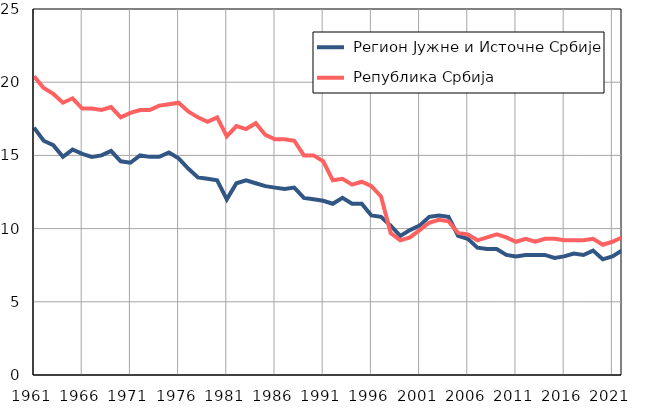
| Category |  Регион Јужне и Источне Србије |  Република Србија |
|---|---|---|
| 1961.0 | 16.9 | 20.4 |
| 1962.0 | 16 | 19.6 |
| 1963.0 | 15.7 | 19.2 |
| 1964.0 | 14.9 | 18.6 |
| 1965.0 | 15.4 | 18.9 |
| 1966.0 | 15.1 | 18.2 |
| 1967.0 | 14.9 | 18.2 |
| 1968.0 | 15 | 18.1 |
| 1969.0 | 15.3 | 18.3 |
| 1970.0 | 14.6 | 17.6 |
| 1971.0 | 14.5 | 17.9 |
| 1972.0 | 15 | 18.1 |
| 1973.0 | 14.9 | 18.1 |
| 1974.0 | 14.9 | 18.4 |
| 1975.0 | 15.2 | 18.5 |
| 1976.0 | 14.8 | 18.6 |
| 1977.0 | 14.1 | 18 |
| 1978.0 | 13.5 | 17.6 |
| 1979.0 | 13.4 | 17.3 |
| 1980.0 | 13.3 | 17.6 |
| 1981.0 | 12 | 16.3 |
| 1982.0 | 13.1 | 17 |
| 1983.0 | 13.3 | 16.8 |
| 1984.0 | 13.1 | 17.2 |
| 1985.0 | 12.9 | 16.4 |
| 1986.0 | 12.8 | 16.1 |
| 1987.0 | 12.7 | 16.1 |
| 1988.0 | 12.8 | 16 |
| 1989.0 | 12.1 | 15 |
| 1990.0 | 12 | 15 |
| 1991.0 | 11.9 | 14.6 |
| 1992.0 | 11.7 | 13.3 |
| 1993.0 | 12.1 | 13.4 |
| 1994.0 | 11.7 | 13 |
| 1995.0 | 11.7 | 13.2 |
| 1996.0 | 10.9 | 12.9 |
| 1997.0 | 10.8 | 12.2 |
| 1998.0 | 10.2 | 9.7 |
| 1999.0 | 9.5 | 9.2 |
| 2000.0 | 9.9 | 9.4 |
| 2001.0 | 10.2 | 9.9 |
| 2002.0 | 10.8 | 10.4 |
| 2003.0 | 10.9 | 10.6 |
| 2004.0 | 10.8 | 10.5 |
| 2005.0 | 9.5 | 9.7 |
| 2006.0 | 9.3 | 9.6 |
| 2007.0 | 8.7 | 9.2 |
| 2008.0 | 8.6 | 9.4 |
| 2009.0 | 8.6 | 9.6 |
| 2010.0 | 8.2 | 9.4 |
| 2011.0 | 8.1 | 9.1 |
| 2012.0 | 8.2 | 9.3 |
| 2013.0 | 8.2 | 9.1 |
| 2014.0 | 8.2 | 9.3 |
| 2015.0 | 8 | 9.3 |
| 2016.0 | 8.1 | 9.2 |
| 2017.0 | 8.3 | 9.2 |
| 2018.0 | 8.2 | 9.2 |
| 2019.0 | 8.5 | 9.3 |
| 2020.0 | 7.9 | 8.9 |
| 2021.0 | 8.1 | 9.1 |
| 2022.0 | 8.5 | 9.4 |